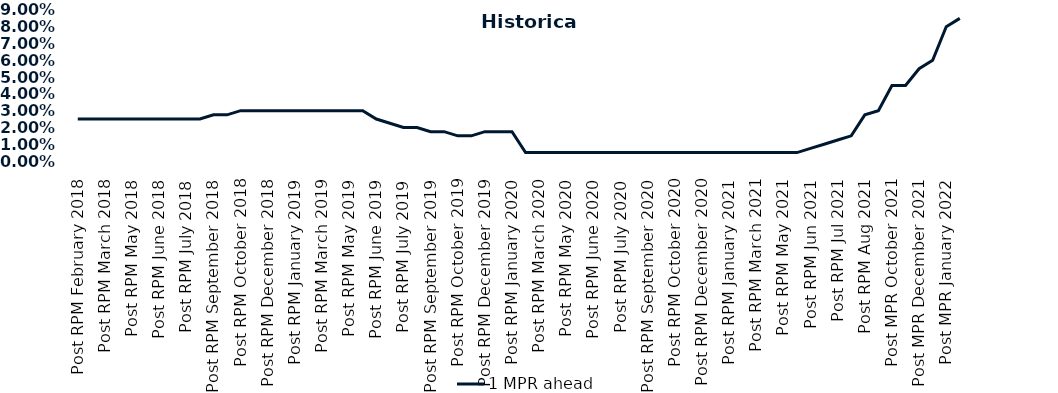
| Category | 1 MPR ahead |
|---|---|
| Post RPM February 2018 | 0.025 |
| Pre RPM March 2018 | 0.025 |
| Post RPM March 2018 | 0.025 |
| Pre RPM May 2018 | 0.025 |
| Post RPM May 2018 | 0.025 |
| Pre RPM June 2018 | 0.025 |
| Post RPM June 2018 | 0.025 |
| Pre RPM July 2018 | 0.025 |
| Post RPM July 2018 | 0.025 |
| Pre RPM September 2018 | 0.025 |
| Post RPM September 2018 | 0.028 |
| Pre RPM October 2018 | 0.028 |
| Post RPM October 2018 | 0.03 |
| Pre RPM December 2018 | 0.03 |
| Post RPM December 2018 | 0.03 |
| Pre RPM January 2019 | 0.03 |
| Post RPM January 2019 | 0.03 |
| Pre RPM March 2019 | 0.03 |
| Post RPM March 2019 | 0.03 |
| Pre RPM May 2019 | 0.03 |
| Post RPM May 2019 | 0.03 |
| Pre RPM June 2019 | 0.03 |
| Post RPM June 2019 | 0.025 |
| Pre RPM July 2019 | 0.022 |
| Post RPM July 2019 | 0.02 |
| Pre RPM September 2019 | 0.02 |
| Post RPM September 2019 | 0.018 |
| Pre RPM October 2019 | 0.018 |
| Post RPM October 2019 | 0.015 |
| Pre RPM December 2019 | 0.015 |
| Post RPM December 2019 | 0.018 |
| Pre RPM January 2020 | 0.018 |
| Post RPM January 2020 | 0.018 |
| Pre RPM March 2020 | 0.005 |
| Post RPM March 2020 | 0.005 |
| Pre RPM May 2020 | 0.005 |
| Post RPM May 2020 | 0.005 |
| Pre RPM June 2020 | 0.005 |
| Post RPM June 2020 | 0.005 |
| Pre RPM July 2020 | 0.005 |
| Post RPM July 2020 | 0.005 |
| Pre RPM September 2020 | 0.005 |
| Post RPM September 2020 | 0.005 |
| Pre RPM October 2020 | 0.005 |
| Post RPM October 2020 | 0.005 |
| Pre RPM December 2020 | 0.005 |
|  Post RPM December 2020 | 0.005 |
| Pre RPM January 2021 | 0.005 |
| Post RPM January 2021 | 0.005 |
|  Pre RPM March 2021 | 0.005 |
|  Post RPM March 2021 | 0.005 |
|  Pre RPM May 2021 | 0.005 |
|  Post RPM May 2021 | 0.005 |
|  Pre RPM Jun 2021 | 0.005 |
|   Post RPM Jun 2021 | 0.008 |
| Pre RPM Jul 2021 | 0.01 |
|  Post RPM Jul 2021 | 0.012 |
| Pre RPM Aug 2021 | 0.015 |
|  Post RPM Aug 2021 | 0.028 |
| Pre MPR October 2021 | 0.03 |
| Post MPR October 2021 | 0.045 |
| Pre MPR December 2021 | 0.045 |
| Post MPR December 2021 | 0.055 |
| Pre MPR January 2022 | 0.06 |
| Post MPR January 2022 | 0.08 |
| Pre MPR March 2022 | 0.085 |